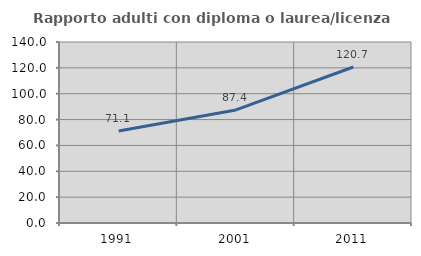
| Category | Rapporto adulti con diploma o laurea/licenza media  |
|---|---|
| 1991.0 | 71.091 |
| 2001.0 | 87.449 |
| 2011.0 | 120.684 |